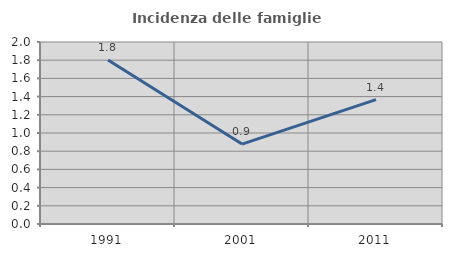
| Category | Incidenza delle famiglie numerose |
|---|---|
| 1991.0 | 1.803 |
| 2001.0 | 0.878 |
| 2011.0 | 1.367 |